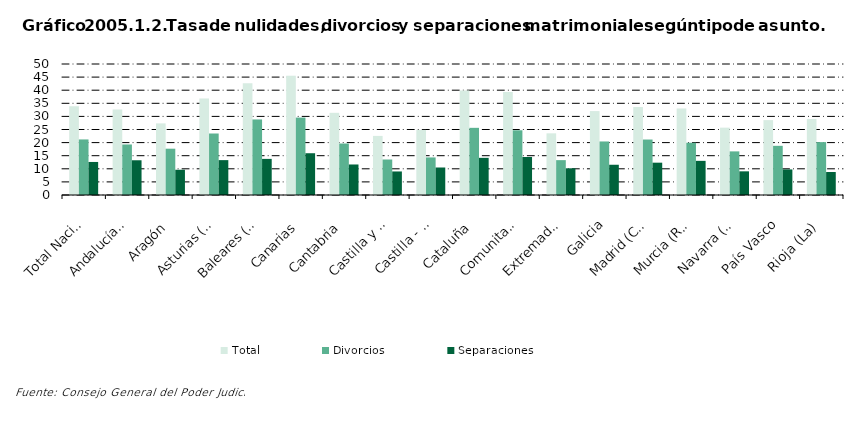
| Category | Total | Divorcios | Separaciones |
|---|---|---|---|
| Total Nacional | 33.864 | 21.206 | 12.613 |
| Andalucía(1) | 32.595 | 19.28 | 13.256 |
| Aragón | 27.336 | 17.675 | 9.637 |
| Asturias (Principado de) | 36.791 | 23.471 | 13.31 |
| Baleares (Illes) | 42.649 | 28.836 | 13.782 |
| Canarias | 45.527 | 29.549 | 15.943 |
| Cantabria | 31.371 | 19.651 | 11.648 |
| Castilla y León | 22.562 | 13.549 | 8.985 |
| Castilla - La Mancha | 24.854 | 14.34 | 10.498 |
| Cataluña | 39.859 | 25.636 | 14.183 |
| Comunitat Valenciana | 39.269 | 24.701 | 14.498 |
| Extremadura | 23.527 | 13.304 | 10.195 |
| Galicia | 32.032 | 20.433 | 11.545 |
| Madrid (Comunidad de) | 33.545 | 21.17 | 12.337 |
| Murcia (Región de) | 33.052 | 19.951 | 13.033 |
| Navarra (Comunidad Foral de) | 25.713 | 16.648 | 9.032 |
| País Vasco | 28.576 | 18.768 | 9.761 |
| Rioja (La) | 28.995 | 20.194 | 8.768 |